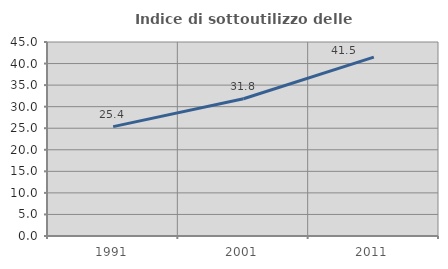
| Category | Indice di sottoutilizzo delle abitazioni  |
|---|---|
| 1991.0 | 25.378 |
| 2001.0 | 31.829 |
| 2011.0 | 41.5 |